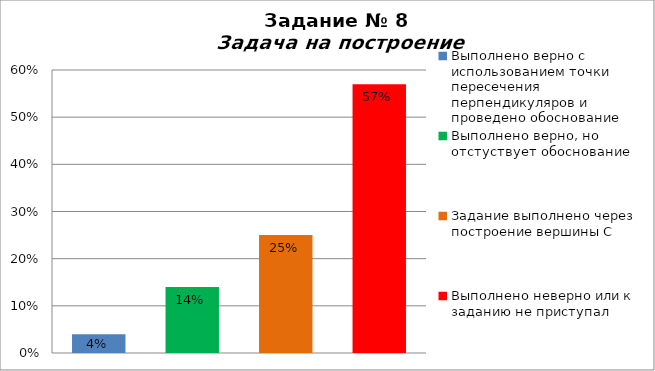
| Category | Задача на построение |
|---|---|
| Выполнено верно с использованием точки пересечения перпендикуляров и проведено обоснование | 0.04 |
| Выполнено верно, но отстуствует обоснование | 0.14 |
| Задание выполнено через построение вершины С | 0.25 |
| Выполнено неверно или к заданию не приступал | 0.57 |